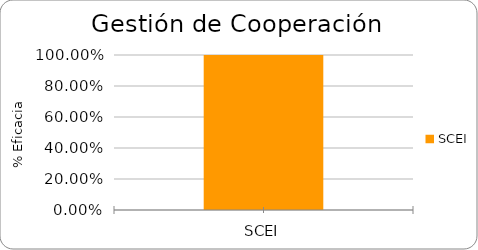
| Category | % Eficacia total |
|---|---|
| SCEI | 1 |